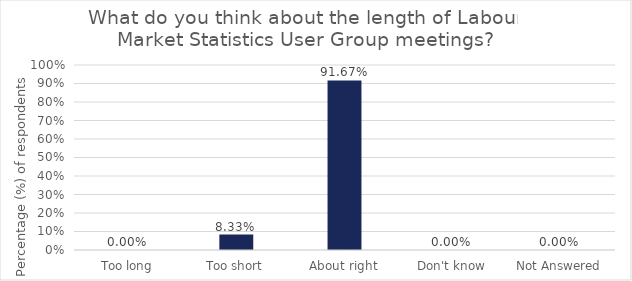
| Category | Series 0 |
|---|---|
| Too long | 0 |
| Too short | 0.083 |
| About right | 0.917 |
| Don't know | 0 |
| Not Answered | 0 |